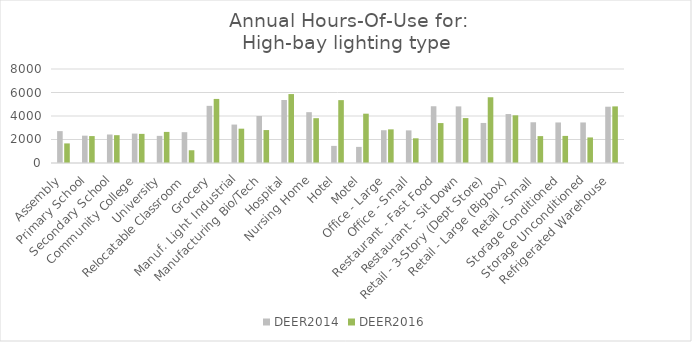
| Category | DEER2014 | DEER2016 |
|---|---|---|
| Assembly | 2712.724 | 1667.52 |
| Primary School | 2326.065 | 2290.702 |
| Secondary School | 2426.16 | 2367.809 |
| Community College | 2503.979 | 2478.116 |
| University | 2310.102 | 2645.928 |
| Relocatable Classroom | 2622.88 | 1085.607 |
| Grocery | 4864.581 | 5452.774 |
| Manuf. Light Industrial | 3271.32 | 2920.616 |
| Manufacturing Bio/Tech | 4001.637 | 2803.41 |
| Hospital | 5361.637 | 5866.037 |
| Nursing Home | 4326.161 | 3814.25 |
| Hotel | 1457.095 | 5350.66 |
| Motel | 1371.891 | 4196.975 |
| Office - Large | 2788.468 | 2863.21 |
| Office - Small | 2776.383 | 2101.864 |
| Restaurant - Fast Food | 4829.583 | 3398.376 |
| Restaurant - Sit Down | 4817.239 | 3822.525 |
| Retail - 3-Story (Dept Store) | 3408.583 | 5595.724 |
| Retail - Large (Bigbox) | 4167.702 | 4059.048 |
| Retail - Small | 3466.778 | 2288.281 |
| Storage Conditioned | 3450.3 | 2305.387 |
| Storage Unconditioned | 3450.3 | 2175.297 |
| Refrigerated Warehouse | 4791.005 | 4818 |